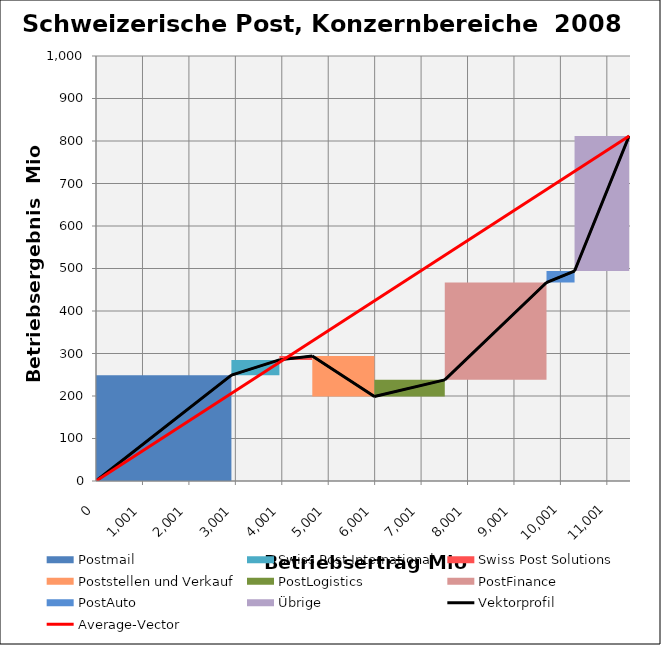
| Category | transparent | Postmail | Swiss Post International | Swiss Post Solutions | Poststellen und Verkauf | PostLogistics | PostFinance | PostAuto | Übrige | Border right & top |
|---|---|---|---|---|---|---|---|---|---|---|
| 0.0 | 0 | 249 | 0 | 0 | 0 | 0 | 0 | 0 | 0 | 0 |
| 2916.0 | 0 | 249 | 0 | 0 | 0 | 0 | 0 | 0 | 0 | 0 |
| 2916.0 | 249 | 0 | 36 | 0 | 0 | 0 | 0 | 0 | 0 | 0 |
| 3950.0 | 249 | 0 | 36 | 0 | 0 | 0 | 0 | 0 | 0 | 0 |
| 3950.0 | 285 | 0 | 0 | 9 | 0 | 0 | 0 | 0 | 0 | 0 |
| 4658.0 | 285 | 0 | 0 | 9 | 0 | 0 | 0 | 0 | 0 | 0 |
| 4658.0 | 294 | 0 | 0 | 0 | -95 | 0 | 0 | 0 | 0 | 0 |
| 5995.0 | 294 | 0 | 0 | 0 | -95 | 0 | 0 | 0 | 0 | 0 |
| 5995.0 | 199 | 0 | 0 | 0 | 0 | 39 | 0 | 0 | 0 | 0 |
| 7511.0 | 199 | 0 | 0 | 0 | 0 | 39 | 0 | 0 | 0 | 0 |
| 7511.0 | 238 | 0 | 0 | 0 | 0 | 0 | 229 | 0 | 0 | 0 |
| 9702.0 | 238 | 0 | 0 | 0 | 0 | 0 | 229 | 0 | 0 | 0 |
| 9702.0 | 467 | 0 | 0 | 0 | 0 | 0 | 0 | 27 | 0 | 0 |
| 10306.0 | 467 | 0 | 0 | 0 | 0 | 0 | 0 | 27 | 0 | 0 |
| 10306.0 | 494 | 0 | 0 | 0 | 0 | 0 | 0 | 0 | 318 | 0 |
| 11482.0 | 494 | 0 | 0 | 0 | 0 | 0 | 0 | 0 | 318 | 0 |
| 11482.0 | 812 | 0 | 0 | 0 | 0 | 0 | 0 | 0 | 0 | 0 |
| 11482.0 | 812 | 0 | 0 | 0 | 0 | 0 | 0 | 0 | 0 | 0 |
| 11482.0 | 812 | 0 | 0 | 0 | 0 | 0 | 0 | 0 | 0 | 0 |
| 11482.0 | 812 | 0 | 0 | 0 | 0 | 0 | 0 | 0 | 0 | 0 |
| 11482.0 | 812 | 0 | 0 | 0 | 0 | 0 | 0 | 0 | 0 | 88 |
| 11500.0 | 812 | 0 | 0 | 0 | 0 | 0 | 0 | 0 | 0 | 88 |
| 11500.0 | 812 | 0 | 0 | 0 | 0 | 0 | 0 | 0 | 0 | 88 |